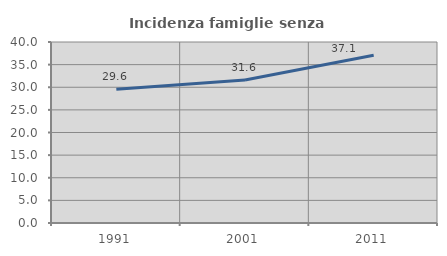
| Category | Incidenza famiglie senza nuclei |
|---|---|
| 1991.0 | 29.559 |
| 2001.0 | 31.612 |
| 2011.0 | 37.085 |